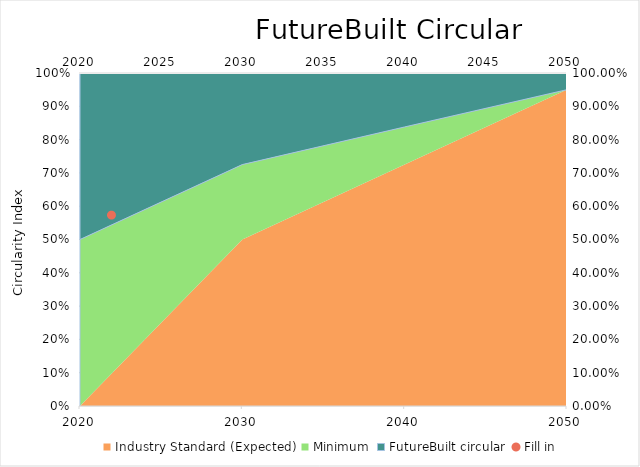
| Category | Industry Standard (Expected) | Minimum | FutureBuilt circular |
|---|---|---|---|
| 2020.0 | 0 | 0.5 | 0.5 |
| 2030.0 | 0.5 | 0.225 | 0.275 |
| 2040.0 | 0.725 | 0.113 | 0.162 |
| 2050.0 | 0.95 | 0 | 0.05 |